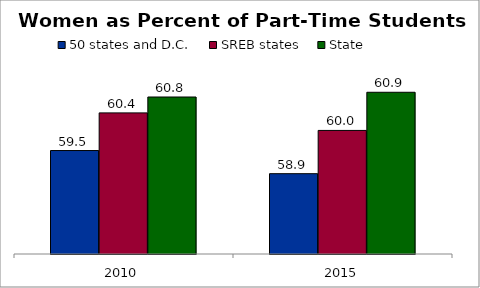
| Category | 50 states and D.C. | SREB states | State |
|---|---|---|---|
| 2010 | 59.503 | 60.414 | 60.798 |
| 2015 | 58.943 | 59.989 | 60.913 |